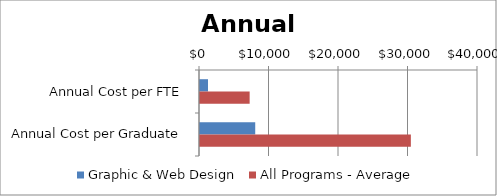
| Category | Graphic & Web Design | All Programs - Average |
|---|---|---|
| Annual Cost per FTE | 1151.631 | 7144 |
| Annual Cost per Graduate | 7946.256 | 30340 |